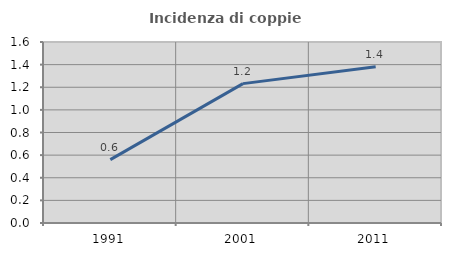
| Category | Incidenza di coppie miste |
|---|---|
| 1991.0 | 0.56 |
| 2001.0 | 1.232 |
| 2011.0 | 1.381 |